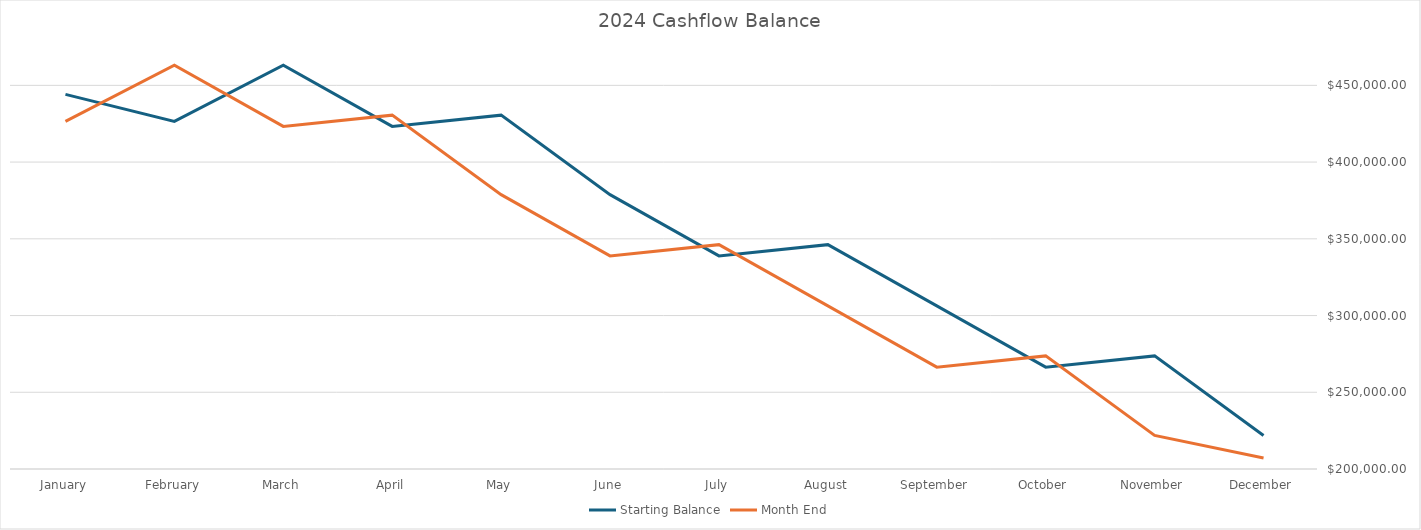
| Category | Starting Balance | Month End |
|---|---|---|
| January | 444111.06 | 426484.91 |
| February | 426484.91 | 463170.85 |
| March | 463170.85 | 423256.83 |
| April | 423256.83 | 430592.81 |
| May | 430592.81 | 378771.78 |
| June | 378771.78 | 338857.76 |
| July | 338857.76 | 346193.74 |
| August | 346193.74 | 306279.72 |
| September | 306279.72 | 266365.7 |
| October | 266365.7 | 273701.68 |
| November | 273701.68 | 221880.65 |
| December | 221880.65 | 207166.63 |